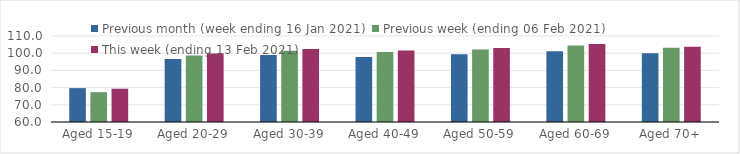
| Category | Previous month (week ending 16 Jan 2021) | Previous week (ending 06 Feb 2021) | This week (ending 13 Feb 2021) |
|---|---|---|---|
| Aged 15-19 | 79.7 | 77.34 | 79.34 |
| Aged 20-29 | 96.65 | 98.72 | 99.86 |
| Aged 30-39 | 98.9 | 101.46 | 102.4 |
| Aged 40-49 | 97.74 | 100.68 | 101.55 |
| Aged 50-59 | 99.38 | 102.11 | 103.07 |
| Aged 60-69 | 101.19 | 104.42 | 105.42 |
| Aged 70+ | 99.93 | 103.16 | 103.75 |